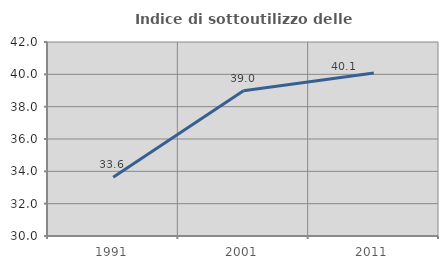
| Category | Indice di sottoutilizzo delle abitazioni  |
|---|---|
| 1991.0 | 33.631 |
| 2001.0 | 38.978 |
| 2011.0 | 40.076 |